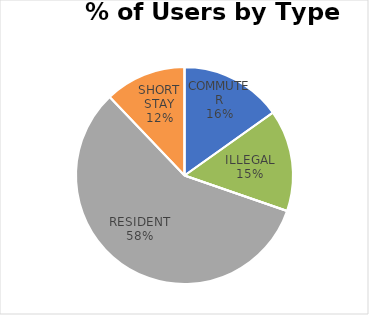
| Category | HOBART PLACE |
|---|---|
| COMMUTER | 5 |
| ILLEGAL | 5 |
| LONG STAY | 0 |
| RESIDENT | 19 |
| SHORT STAY | 4 |
| DISABLED | 0 |
| OTHER | 0 |